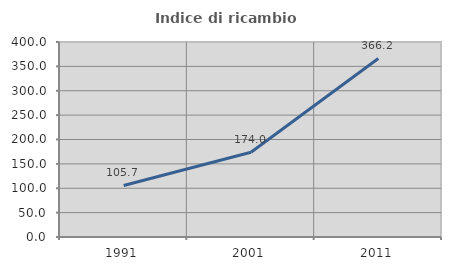
| Category | Indice di ricambio occupazionale  |
|---|---|
| 1991.0 | 105.696 |
| 2001.0 | 174 |
| 2011.0 | 366.197 |